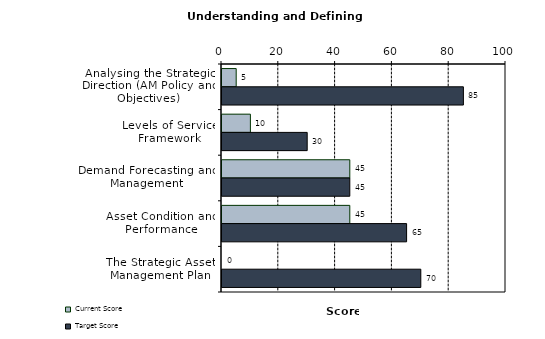
| Category | Current Score | Target Score |
|---|---|---|
| Analysing the Strategic Direction (AM Policy and Objectives)
 | 5 | 85 |
| Levels of Service Framework
 | 10 | 30 |
| Demand Forecasting and Management | 45 | 45 |
| Asset Condition and Performance | 45 | 65 |
| The Strategic Asset Management Plan
 | 0 | 70 |